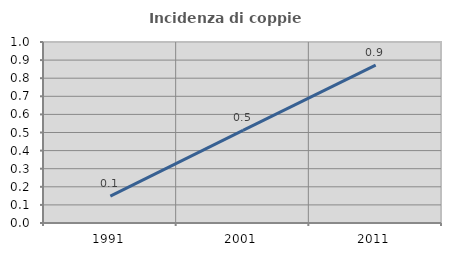
| Category | Incidenza di coppie miste |
|---|---|
| 1991.0 | 0.149 |
| 2001.0 | 0.512 |
| 2011.0 | 0.872 |